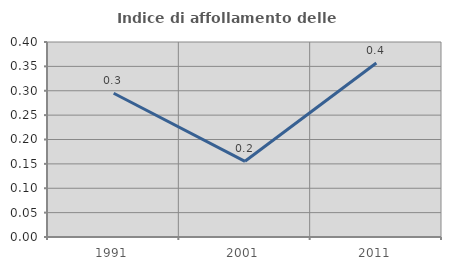
| Category | Indice di affollamento delle abitazioni  |
|---|---|
| 1991.0 | 0.295 |
| 2001.0 | 0.155 |
| 2011.0 | 0.357 |